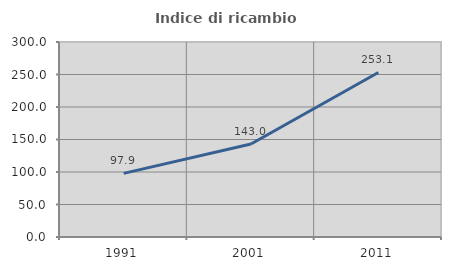
| Category | Indice di ricambio occupazionale  |
|---|---|
| 1991.0 | 97.941 |
| 2001.0 | 143.048 |
| 2011.0 | 253.125 |